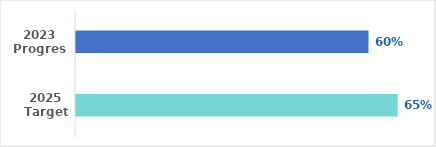
| Category | Series 0 |
|---|---|
| 2023 Progress | 0.6 |
| 2025 Target | 0.65 |